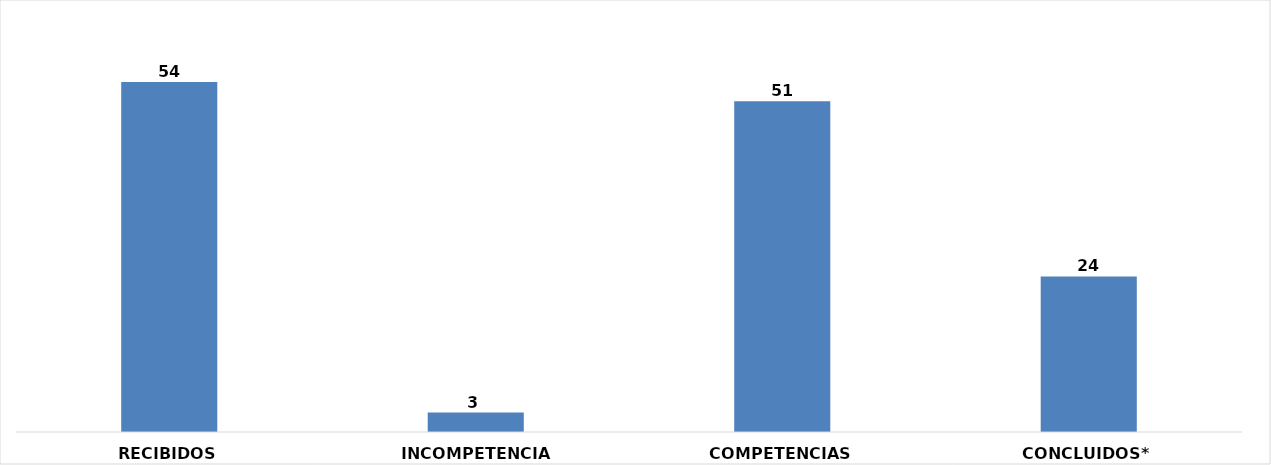
| Category | CANTIDAD |
|---|---|
| RECIBIDOS | 54 |
| INCOMPETENCIAS | 3 |
| COMPETENCIAS | 51 |
| CONCLUIDOS* | 24 |